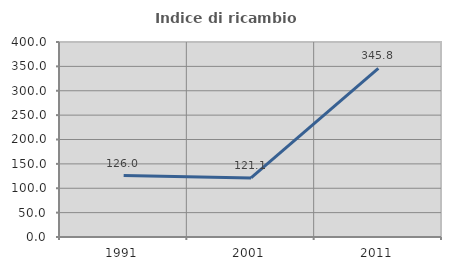
| Category | Indice di ricambio occupazionale  |
|---|---|
| 1991.0 | 126.027 |
| 2001.0 | 121.111 |
| 2011.0 | 345.833 |